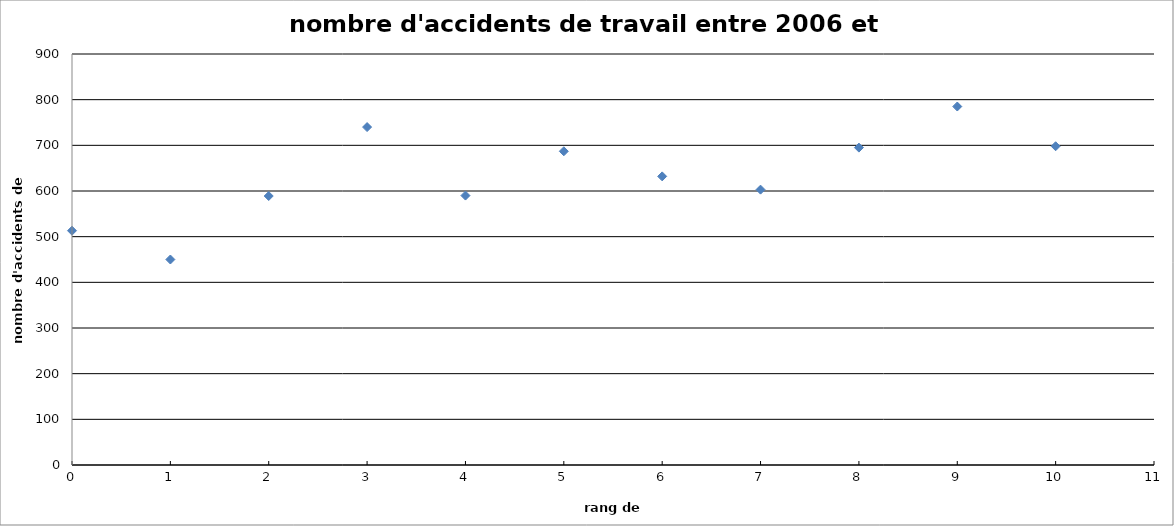
| Category | nombre d'accidents de travail yi |
|---|---|
| 0.0 | 513 |
| 1.0 | 450 |
| 2.0 | 589 |
| 3.0 | 740 |
| 4.0 | 590 |
| 5.0 | 687 |
| 6.0 | 632 |
| 7.0 | 603 |
| 8.0 | 695 |
| 9.0 | 785 |
| 10.0 | 698 |